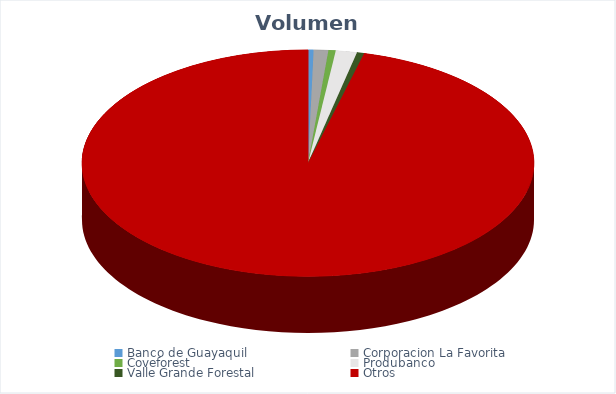
| Category | VOLUMEN ($USD) |
|---|---|
| Banco de Guayaquil | 5333.24 |
| Corporacion La Favorita | 14137.67 |
| Coveforest | 7001.8 |
| Produbanco | 20400 |
| Valle Grande Forestal | 7001.8 |
| Otros | 1296852.2 |